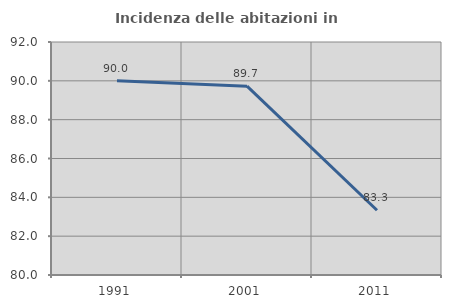
| Category | Incidenza delle abitazioni in proprietà  |
|---|---|
| 1991.0 | 90 |
| 2001.0 | 89.726 |
| 2011.0 | 83.333 |